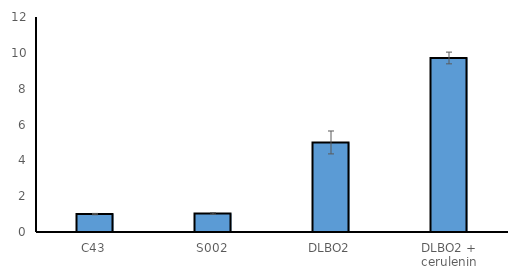
| Category | C8 |
|---|---|
| C43 | 1 |
| S002 | 1.039 |
| DLBO2 | 4.998 |
| DLBO2 + cerulenin | 9.713 |